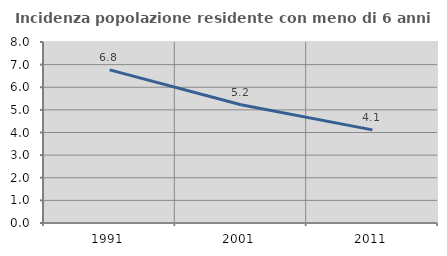
| Category | Incidenza popolazione residente con meno di 6 anni |
|---|---|
| 1991.0 | 6.767 |
| 2001.0 | 5.227 |
| 2011.0 | 4.117 |